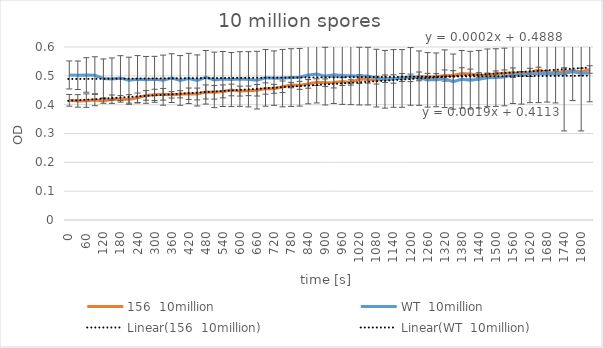
| Category | 156  10million | WT  10million |
|---|---|---|
| 0.0 | 0.415 | 0.503 |
| 30.0 | 0.413 | 0.502 |
| 60.0 | 0.414 | 0.503 |
| 90.0 | 0.416 | 0.502 |
| 120.0 | 0.413 | 0.491 |
| 150.0 | 0.419 | 0.489 |
| 180.0 | 0.42 | 0.492 |
| 210.0 | 0.418 | 0.485 |
| 240.0 | 0.424 | 0.488 |
| 270.0 | 0.432 | 0.486 |
| 300.0 | 0.434 | 0.488 |
| 330.0 | 0.436 | 0.485 |
| 360.0 | 0.434 | 0.492 |
| 390.0 | 0.436 | 0.484 |
| 420.0 | 0.438 | 0.491 |
| 450.0 | 0.437 | 0.484 |
| 480.0 | 0.444 | 0.495 |
| 510.0 | 0.443 | 0.486 |
| 540.0 | 0.446 | 0.489 |
| 570.0 | 0.451 | 0.487 |
| 600.0 | 0.447 | 0.489 |
| 630.0 | 0.448 | 0.488 |
| 660.0 | 0.45 | 0.485 |
| 690.0 | 0.456 | 0.493 |
| 720.0 | 0.455 | 0.492 |
| 750.0 | 0.462 | 0.492 |
| 780.0 | 0.468 | 0.494 |
| 810.0 | 0.467 | 0.495 |
| 840.0 | 0.472 | 0.503 |
| 870.0 | 0.478 | 0.506 |
| 900.0 | 0.476 | 0.499 |
| 930.0 | 0.477 | 0.504 |
| 960.0 | 0.48 | 0.501 |
| 990.0 | 0.477 | 0.5 |
| 1020.0 | 0.489 | 0.499 |
| 1050.0 | 0.487 | 0.499 |
| 1080.0 | 0.485 | 0.492 |
| 1110.0 | 0.49 | 0.488 |
| 1140.0 | 0.489 | 0.491 |
| 1170.0 | 0.494 | 0.491 |
| 1200.0 | 0.493 | 0.498 |
| 1230.0 | 0.498 | 0.492 |
| 1260.0 | 0.496 | 0.486 |
| 1290.0 | 0.497 | 0.486 |
| 1320.0 | 0.501 | 0.49 |
| 1350.0 | 0.501 | 0.48 |
| 1380.0 | 0.508 | 0.488 |
| 1410.0 | 0.506 | 0.485 |
| 1440.0 | 0.502 | 0.488 |
| 1470.0 | 0.502 | 0.493 |
| 1500.0 | 0.507 | 0.494 |
| 1530.0 | 0.509 | 0.496 |
| 1560.0 | 0.511 | 0.504 |
| 1590.0 | 0.507 | 0.502 |
| 1620.0 | 0.512 | 0.507 |
| 1650.0 | 0.52 | 0.507 |
| 1680.0 | 0.511 | 0.509 |
| 1710.0 | 0.511 | 0.506 |
| 1740.0 | 0.516 | 0.509 |
| 1770.0 | 0.516 | 0.514 |
| 1800.0 | 0.514 | 0.509 |
| 1830.0 | 0.522 | 0.51 |